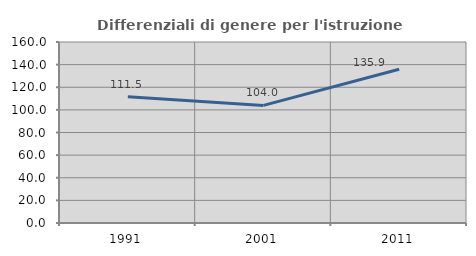
| Category | Differenziali di genere per l'istruzione superiore |
|---|---|
| 1991.0 | 111.516 |
| 2001.0 | 103.953 |
| 2011.0 | 135.859 |